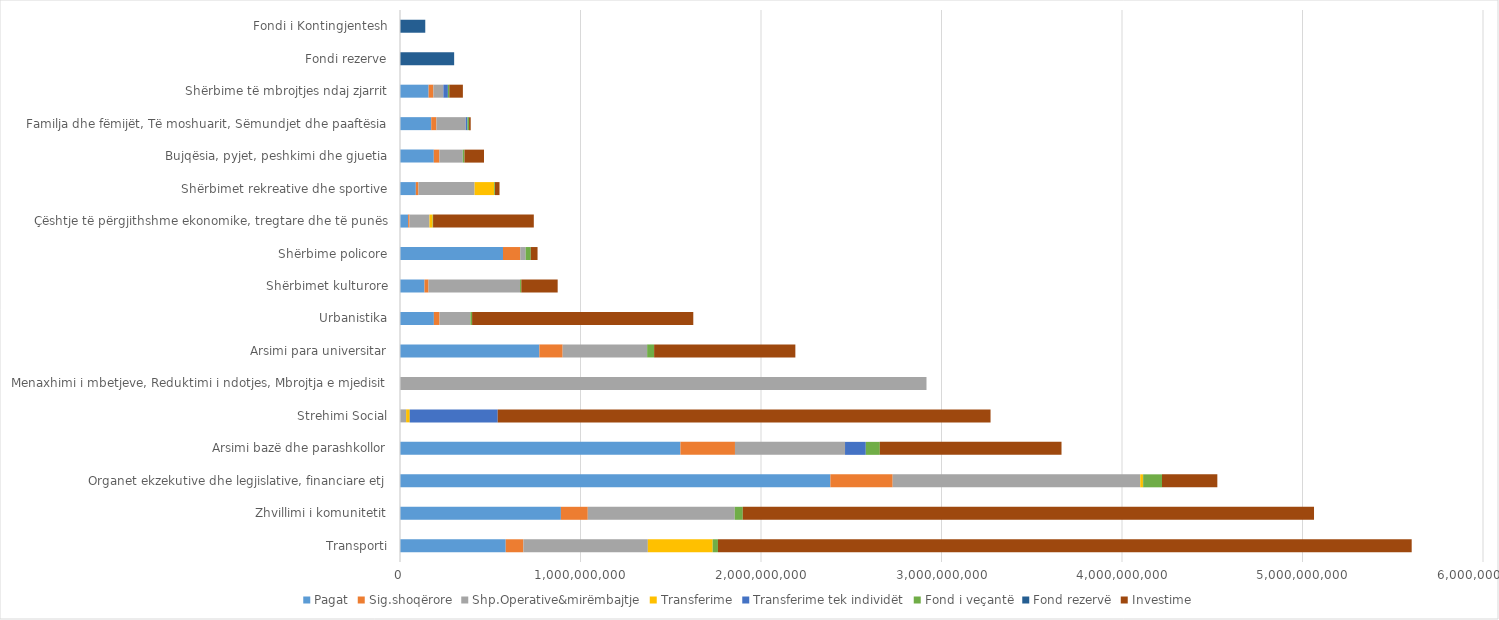
| Category | Pagat | Sig.shoqërore | Shp.Operative&mirëmbajtje | Transferime | Transferime tek individët | Fond i veçantë | Fond rezervë | Investime |
|---|---|---|---|---|---|---|---|---|
| Transporti | 585692000 | 97837000 | 689520619 | 359143520 | 0 | 29284000 | 0 | 3843449104 |
| Zhvillimi i komunitetit | 891508000 | 148910000 | 814100000 | 0 | 0 | 44574000 | 0 | 3164711118 |
| Organet ekzekutive dhe legjislative, financiare etj | 2384464510 | 345123000 | 1371588988 | 15000000 | 1000000 | 104370000 | 0 | 306642396 |
| Arsimi bazë dhe parashkollor | 1553721000 | 302090104 | 609731705 | 0 | 115000000 | 77686600 | 0 | 1006675900 |
| Strehimi Social | 0 | 0 | 33950000 | 20000000 | 487500000 | 0 | 0 | 2730278660 |
| Menaxhimi i mbetjeve, Reduktimi i ndotjes, Mbrojtja e mjedisit | 0 | 0 | 2916889090 | 0 | 0 | 0 | 0 | 0 |
| Arsimi para universitar | 772252000 | 128965000 | 468000000 | 0 | 0 | 38613000 | 0 | 782525384 |
| Urbanistika | 187688000 | 31344000 | 171050000 | 0 | 0 | 9384000 | 0 | 1225440359 |
| Shërbimet kulturore | 135559000 | 22640000 | 507000000 | 0 | 0 | 6779000 | 0 | 201558572 |
| Shërbime policore | 570619000 | 95495000 | 30000000 | 0 | 0 | 28531000 | 0 | 37400000 |
| Çështje të përgjithshme ekonomike, tregtare dhe të punës | 45107000 | 7533000 | 110600224 | 17685750 | 0 | 2255000 | 0 | 558159268 |
| Shërbimet rekreative dhe sportive | 87638000 | 14638000 | 310972000 | 108600000 | 0 | 4382000 | 0 | 25100000 |
| Bujqësia, pyjet, peshkimi dhe gjuetia | 187216000 | 31265000 | 129461045 | 0 | 0 | 9361000 | 0 | 108119608 |
| Familja dhe fëmijët, Të moshuarit, Sëmundjet dhe paaftësia | 172998000 | 28952000 | 161645920 | 300000 | 10000000 | 8652000 | 0 | 9227820 |
| Shërbime të mbrojtjes ndaj zjarrit | 158530000 | 26474000 | 55296000 | 0 | 25000000 | 7926000 | 0 | 75160375 |
| Fondi rezerve | 0 | 0 | 0 | 0 | 0 | 0 | 300000000 | 0 |
| Fondi i Kontingjentesh | 0 | 0 | 0 | 0 | 0 | 0 | 140000000 | 0 |